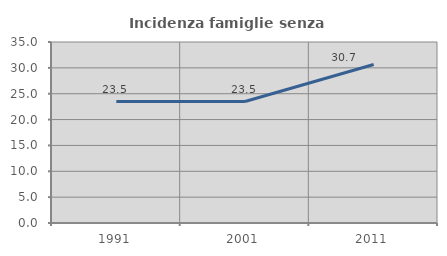
| Category | Incidenza famiglie senza nuclei |
|---|---|
| 1991.0 | 23.488 |
| 2001.0 | 23.49 |
| 2011.0 | 30.65 |